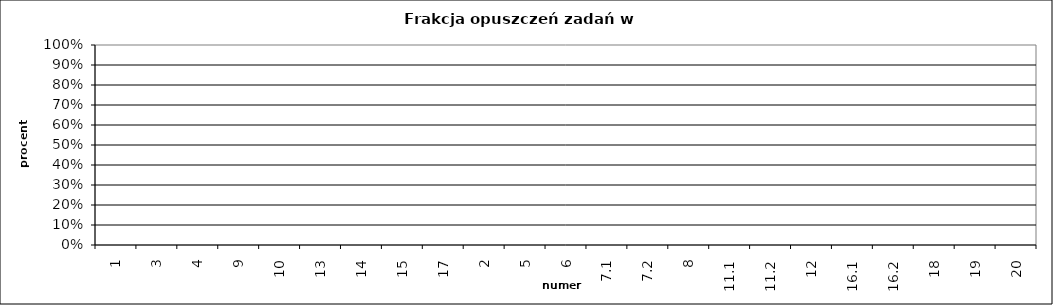
| Category | FO |
|---|---|
| 1 | 0 |
| 3 | 0 |
| 4 | 0 |
| 9 | 0 |
| 10 | 0 |
| 13 | 0 |
| 14 | 0 |
| 15 | 0 |
| 17 | 0 |
| 2 | 0 |
| 5 | 0 |
| 6 | 0 |
| 7.1 | 0 |
| 7.2 | 0 |
| 8 | 0 |
| 11.1 | 0 |
| 11.2 | 0 |
| 12 | 0 |
| 16.1 | 0 |
| 16.2 | 0 |
| 18 | 0 |
| 19 | 0 |
| 20 | 0 |